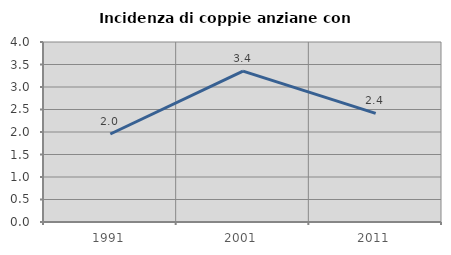
| Category | Incidenza di coppie anziane con figli |
|---|---|
| 1991.0 | 1.955 |
| 2001.0 | 3.352 |
| 2011.0 | 2.413 |